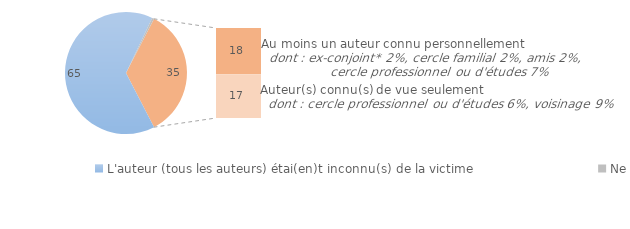
| Category | Series 0 |
|---|---|
| L'auteur (tous les auteurs) étai(en)t inconnu(s) de la victime | 65.088 |
| Ne sait pas/Refus | 0.553 |
| L'auteur (au moins un auteur) était connu de vue ou personnellement  | 18 |